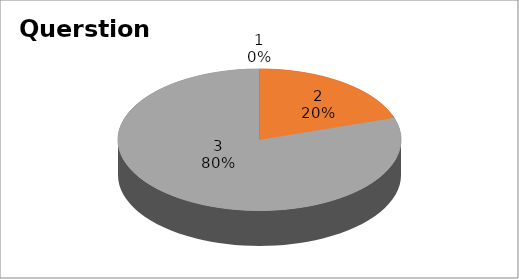
| Category | Series 0 |
|---|---|
| 0 | 0 |
| 1 | 4 |
| 2 | 16 |